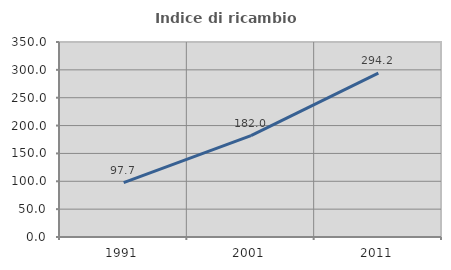
| Category | Indice di ricambio occupazionale  |
|---|---|
| 1991.0 | 97.74 |
| 2001.0 | 181.973 |
| 2011.0 | 294.247 |